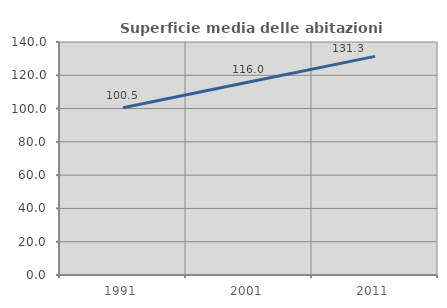
| Category | Superficie media delle abitazioni occupate |
|---|---|
| 1991.0 | 100.457 |
| 2001.0 | 116.007 |
| 2011.0 | 131.346 |